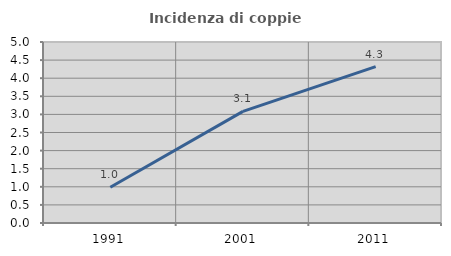
| Category | Incidenza di coppie miste |
|---|---|
| 1991.0 | 0.987 |
| 2001.0 | 3.084 |
| 2011.0 | 4.32 |